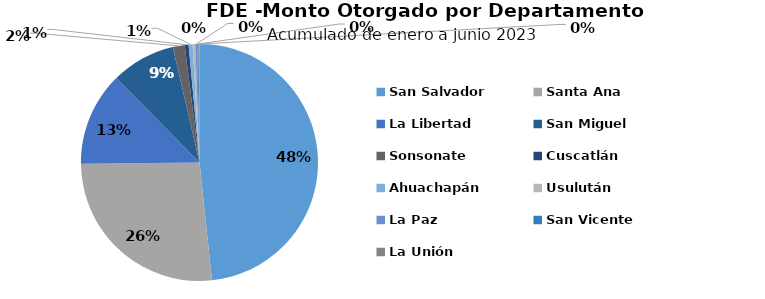
| Category | Monto |
|---|---|
| San Salvador | 2.203 |
| Santa Ana | 1.209 |
| La Libertad | 0.583 |
| San Miguel | 0.399 |
| Sonsonate | 0.074 |
| Cuscatlán | 0.024 |
| Ahuachapán | 0.024 |
| Usulután | 0.017 |
| La Paz | 0.012 |
| San Vicente | 0.008 |
| La Unión | 0.005 |